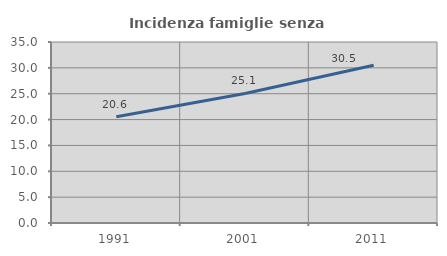
| Category | Incidenza famiglie senza nuclei |
|---|---|
| 1991.0 | 20.552 |
| 2001.0 | 25.056 |
| 2011.0 | 30.503 |